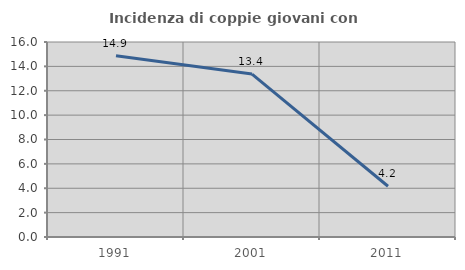
| Category | Incidenza di coppie giovani con figli |
|---|---|
| 1991.0 | 14.865 |
| 2001.0 | 13.368 |
| 2011.0 | 4.167 |